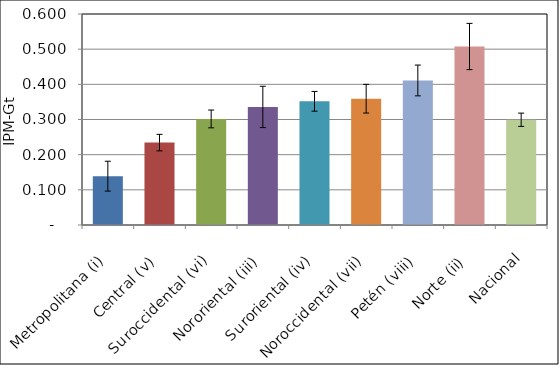
| Category | Series 0 |
|---|---|
| Metropolitana (i) | 0.139 |
| Central (v) | 0.234 |
| Suroccidental (vi) | 0.302 |
| Nororiental (iii) | 0.336 |
| Suroriental (iv) | 0.352 |
| Noroccidental (vii) | 0.359 |
| Petén (viii) | 0.411 |
| Norte (ii) | 0.508 |
| Nacional | 0.299 |